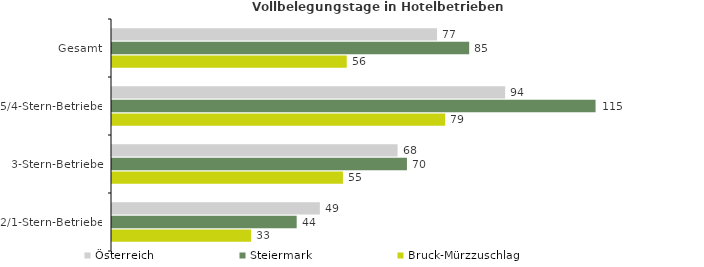
| Category | Österreich | Steiermark | Bruck-Mürzzuschlag |
|---|---|---|---|
| Gesamt | 77.394 | 85.042 | 55.892 |
| 5/4-Stern-Betriebe | 93.608 | 115.133 | 79.316 |
| 3-Stern-Betriebe | 67.992 | 70.225 | 54.986 |
| 2/1-Stern-Betriebe | 49.488 | 43.973 | 33.109 |